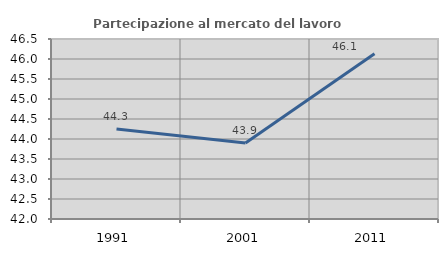
| Category | Partecipazione al mercato del lavoro  femminile |
|---|---|
| 1991.0 | 44.252 |
| 2001.0 | 43.902 |
| 2011.0 | 46.129 |